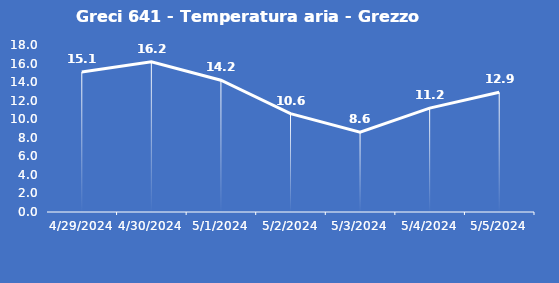
| Category | Greci 641 - Temperatura aria - Grezzo (°C) |
|---|---|
| 4/29/24 | 15.1 |
| 4/30/24 | 16.2 |
| 5/1/24 | 14.2 |
| 5/2/24 | 10.6 |
| 5/3/24 | 8.6 |
| 5/4/24 | 11.2 |
| 5/5/24 | 12.9 |